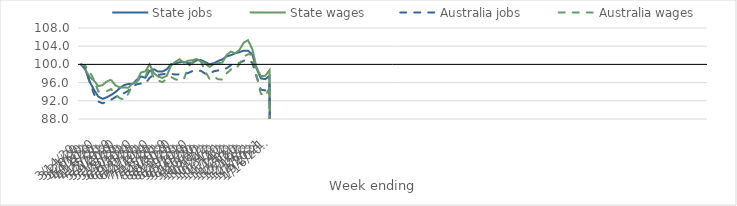
| Category | State jobs | State wages | Australia jobs | Australia wages |
|---|---|---|---|---|
| 14/03/2020 | 100 | 100 | 100 | 100 |
| 21/03/2020 | 98.82 | 98.867 | 99.215 | 99.668 |
| 28/03/2020 | 96.187 | 97.183 | 96.153 | 98.379 |
| 04/04/2020 | 94.417 | 96.457 | 93.502 | 96.626 |
| 11/04/2020 | 92.934 | 95.227 | 91.838 | 94.061 |
| 18/04/2020 | 92.432 | 95.445 | 91.448 | 93.977 |
| 25/04/2020 | 92.769 | 96.266 | 91.813 | 94.111 |
| 02/05/2020 | 93.286 | 96.632 | 92.231 | 94.578 |
| 09/05/2020 | 93.899 | 95.402 | 92.806 | 93.416 |
| 16/05/2020 | 94.755 | 94.96 | 93.353 | 92.605 |
| 23/05/2020 | 95.429 | 94.939 | 93.674 | 92.236 |
| 30/05/2020 | 95.698 | 94.864 | 94.181 | 93.508 |
| 06/06/2020 | 95.69 | 95.777 | 95.128 | 95.497 |
| 13/06/2020 | 96.616 | 96.281 | 95.639 | 96.189 |
| 20/06/2020 | 97.355 | 98.224 | 95.802 | 97.174 |
| 27/06/2020 | 97.062 | 98.461 | 95.768 | 97.323 |
| 04/07/2020 | 98.579 | 100.025 | 97.053 | 99.476 |
| 11/07/2020 | 98.923 | 98.072 | 97.772 | 96.928 |
| 18/07/2020 | 98.412 | 97.312 | 97.691 | 96.451 |
| 25/07/2020 | 98.441 | 97.023 | 97.829 | 96.097 |
| 01/08/2020 | 98.905 | 97.484 | 97.979 | 96.806 |
| 08/08/2020 | 100.05 | 99.725 | 97.922 | 97.248 |
| 15/08/2020 | 100.182 | 100.544 | 97.789 | 96.723 |
| 22/08/2020 | 100.479 | 101.135 | 97.812 | 96.531 |
| 29/08/2020 | 100.526 | 100.363 | 97.884 | 96.715 |
| 05/09/2020 | 100.274 | 100.809 | 98.101 | 99.468 |
| 12/09/2020 | 100.295 | 100.912 | 98.536 | 100.455 |
| 19/09/2020 | 100.926 | 101.203 | 98.701 | 101.226 |
| 26/09/2020 | 100.954 | 100.654 | 98.574 | 100.61 |
| 03/10/2020 | 100.524 | 100.198 | 97.954 | 98.463 |
| 10/10/2020 | 100.019 | 99.451 | 97.882 | 96.815 |
| 17/10/2020 | 100.26 | 100.047 | 98.486 | 97.316 |
| 24/10/2020 | 100.732 | 100.246 | 98.675 | 96.732 |
| 31/10/2020 | 101.104 | 100.413 | 98.779 | 96.679 |
| 07/11/2020 | 101.766 | 102.041 | 99.161 | 98.026 |
| 14/11/2020 | 102.019 | 102.8 | 99.803 | 98.893 |
| 21/11/2020 | 102.467 | 102.429 | 100.059 | 98.847 |
| 28/11/2020 | 102.675 | 103.177 | 100.31 | 100.101 |
| 05/12/2020 | 103.021 | 104.775 | 100.817 | 101.732 |
| 12/12/2020 | 103.012 | 105.323 | 101.015 | 102.219 |
| 19/12/2020 | 102.185 | 103.366 | 100.355 | 102.16 |
| 26/12/2020 | 99.093 | 99.274 | 97.322 | 97.485 |
| 02/01/2021 | 96.936 | 97.421 | 94.445 | 93.574 |
| 09/01/2021 | 96.761 | 97.488 | 94.284 | 92.978 |
| 16/01/2021 | 97.442 | 98.699 | 95.7 | 94.76 |